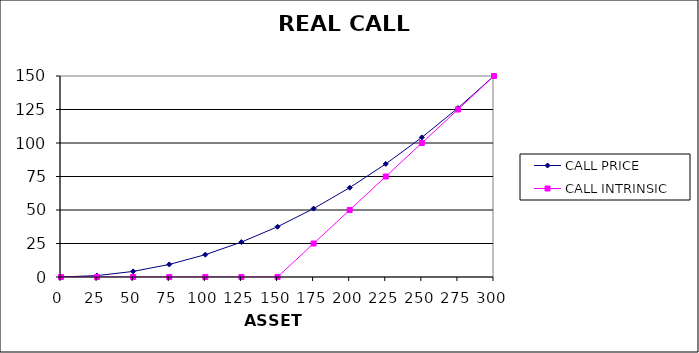
| Category | CALL PRICE | CALL INTRINSIC |
|---|---|---|
| 0.0 | 0 | 0 |
| 25.0 | 1.042 | 0 |
| 50.0 | 4.167 | 0 |
| 75.0 | 9.375 | 0 |
| 100.0 | 16.667 | 0 |
| 125.0 | 26.042 | 0 |
| 150.0 | 37.5 | 0 |
| 175.0 | 51.042 | 25 |
| 200.0 | 66.667 | 50 |
| 225.0 | 84.375 | 75 |
| 250.0 | 104.167 | 100 |
| 275.0 | 126.042 | 125 |
| 300.0 | 150 | 150 |